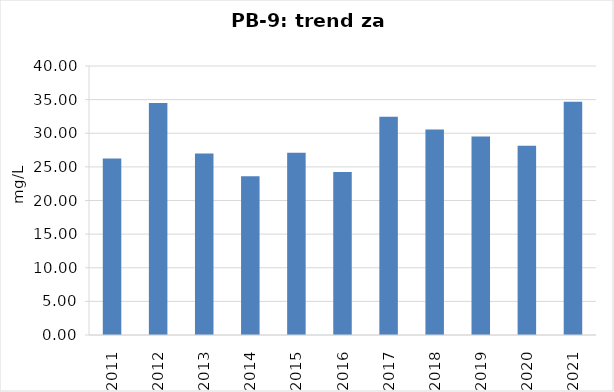
| Category | Vsota |
|---|---|
| 2011 | 26.25 |
| 2012 | 34.5 |
| 2013 | 27 |
| 2014 | 23.6 |
| 2015 | 27.1 |
| 2016 | 24.25 |
| 2017 | 32.45 |
| 2018 | 30.55 |
| 2019 | 29.5 |
| 2020 | 28.15 |
| 2021 | 34.7 |